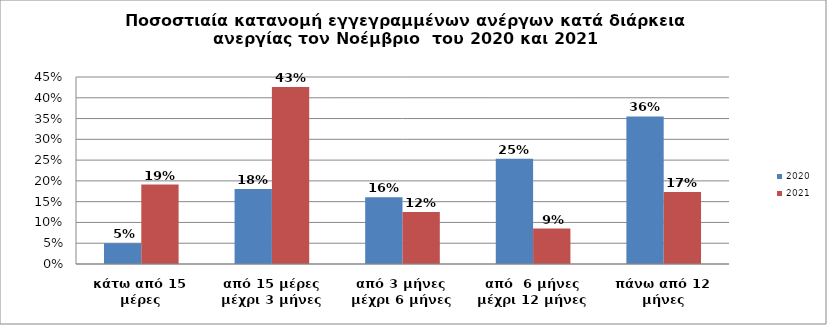
| Category | 2020 | 2021 |
|---|---|---|
| κάτω από 15 μέρες | 0.05 | 0.191 |
| από 15 μέρες μέχρι 3 μήνες | 0.181 | 0.426 |
| από 3 μήνες μέχρι 6 μήνες | 0.161 | 0.125 |
| από  6 μήνες μέχρι 12 μήνες | 0.253 | 0.085 |
| πάνω από 12 μήνες | 0.355 | 0.173 |